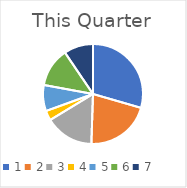
| Category | Series 0 |
|---|---|
| 0 | 0.295 |
| 1 | 0.211 |
| 2 | 0.158 |
| 3 | 0.032 |
| 4 | 0.084 |
| 5 | 0.126 |
| 6 | 0.095 |